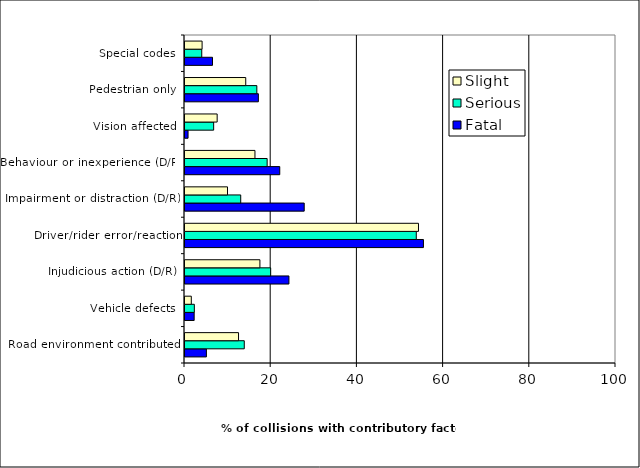
| Category | Fatal | Serious | Slight |
|---|---|---|---|
| Road environment contributed | 4.965 | 13.752 | 12.422 |
| Vehicle defects | 2.128 | 2.167 | 1.461 |
| Injudicious action (D/R) | 24.113 | 19.88 | 17.38 |
| Driver/rider error/reaction | 55.319 | 53.662 | 54.175 |
| Impairment or distraction (D/R) | 27.66 | 12.93 | 9.864 |
| Behaviour or inexperience (D/R) | 21.986 | 19.058 | 16.232 |
| Vision affected | 0.709 | 6.652 | 7.463 |
| Pedestrian only | 17.021 | 16.667 | 14.092 |
| Special codes | 6.383 | 3.886 | 3.967 |